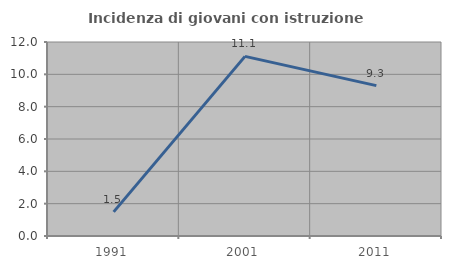
| Category | Incidenza di giovani con istruzione universitaria |
|---|---|
| 1991.0 | 1.493 |
| 2001.0 | 11.111 |
| 2011.0 | 9.302 |